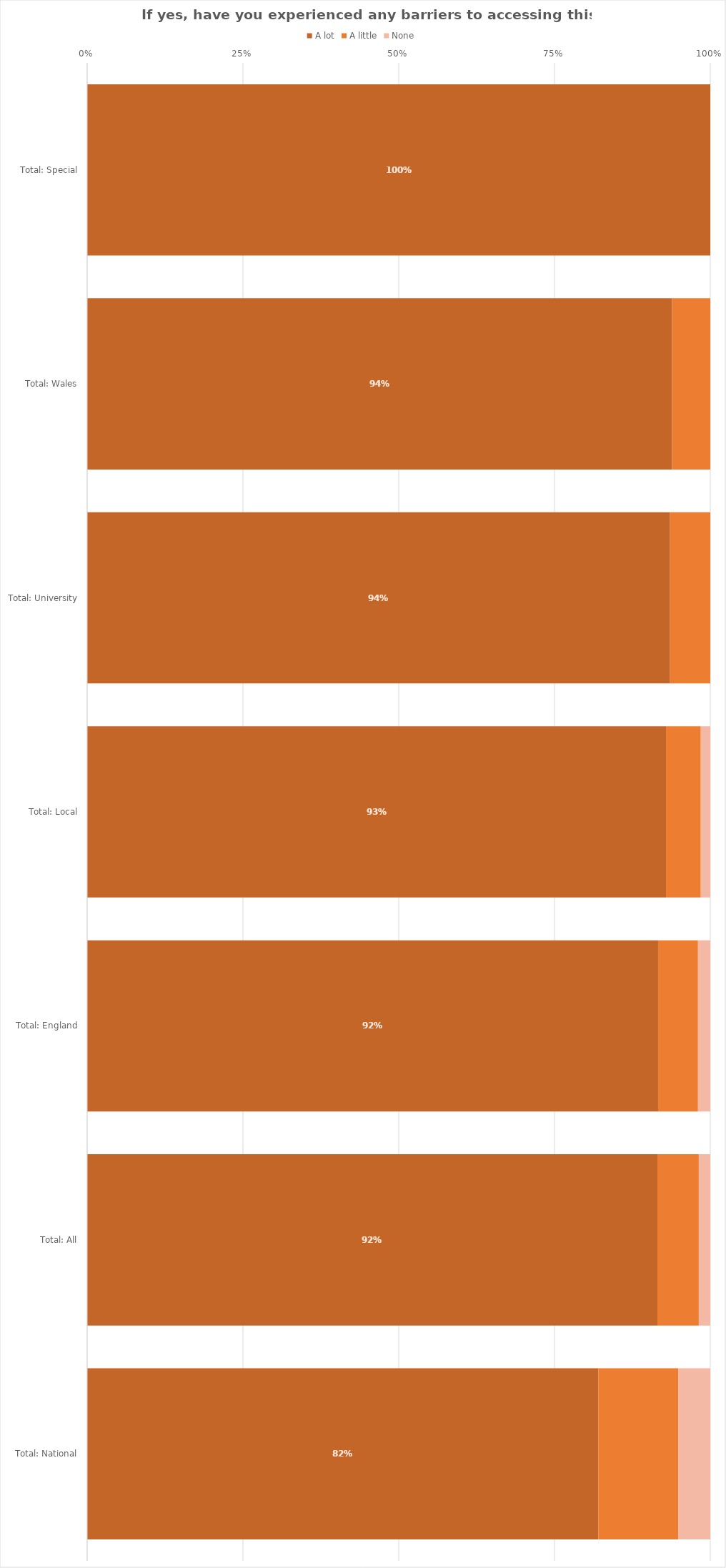
| Category | A lot | A little | None |
|---|---|---|---|
| Total: Special | 1 | 0 | 0 |
| Total: Wales | 0.939 | 0.061 | 0 |
| Total: University | 0.935 | 0.065 | 0 |
| Total: Local | 0.929 | 0.056 | 0.015 |
| Total: England | 0.916 | 0.064 | 0.02 |
| Total: All | 0.915 | 0.066 | 0.018 |
| Total: National | 0.821 | 0.128 | 0.051 |